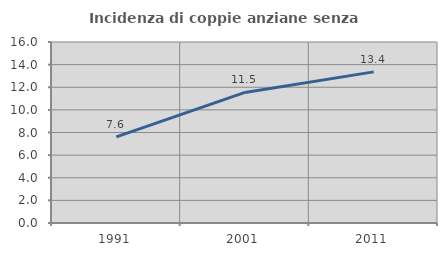
| Category | Incidenza di coppie anziane senza figli  |
|---|---|
| 1991.0 | 7.615 |
| 2001.0 | 11.543 |
| 2011.0 | 13.36 |